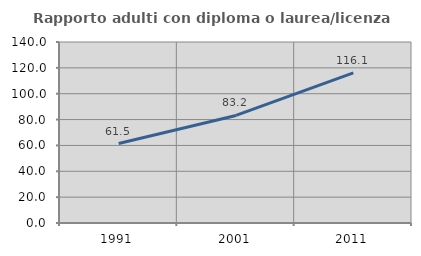
| Category | Rapporto adulti con diploma o laurea/licenza media  |
|---|---|
| 1991.0 | 61.465 |
| 2001.0 | 83.184 |
| 2011.0 | 116.055 |